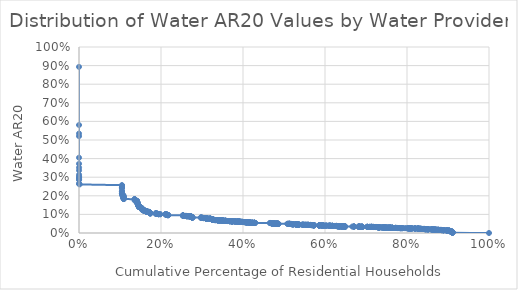
| Category | AR20_water |
|---|---|
| 5.48826520119832e-07 | 0.893 |
| 5.33443075563351e-05 | 0.581 |
| 7.17975943236906e-05 | 0.535 |
| 7.32451695270934e-05 | 0.521 |
| 7.46652534685267e-05 | 0.405 |
| 9.82372535127435e-05 | 0.372 |
| 0.000152683214745455 | 0.352 |
| 0.000185217545983208 | 0.337 |
| 0.00018708458604609 | 0.313 |
| 0.000192971497076845 | 0.304 |
| 0.000193919867193345 | 0.297 |
| 0.000194206909401911 | 0.296 |
| 0.000196433551373386 | 0.288 |
| 0.000198798018053897 | 0.285 |
| 0.00021031373547938 | 0.265 |
| 0.000254667359736511 | 0.264 |
| 0.00158401532059414 | 0.261 |
| 0.104717175594087 | 0.257 |
| 0.104717731194048 | 0.255 |
| 0.104721974051909 | 0.254 |
| 0.10472407977018 | 0.247 |
| 0.104725020967927 | 0.245 |
| 0.104727404614923 | 0.243 |
| 0.104732030883355 | 0.242 |
| 0.104745008982685 | 0.241 |
| 0.10475055911262 | 0.225 |
| 0.104752740565179 | 0.224 |
| 0.104753450633753 | 0.222 |
| 0.104754679258546 | 0.214 |
| 0.104755242322187 | 0.212 |
| 0.104756998741014 | 0.212 |
| 0.105547062052138 | 0.212 |
| 0.105547900815649 | 0.208 |
| 0.105566377816492 | 0.204 |
| 0.105567160821771 | 0.203 |
| 0.108078254910355 | 0.203 |
| 0.108079344993869 | 0.201 |
| 0.108081290420234 | 0.201 |
| 0.108102868388849 | 0.198 |
| 0.108310116820655 | 0.197 |
| 0.108310805948697 | 0.196 |
| 0.108318891051255 | 0.194 |
| 0.108320298879155 | 0.193 |
| 0.108321601371382 | 0.193 |
| 0.108468333978576 | 0.191 |
| 0.108489911894035 | 0.191 |
| 0.108491312655666 | 0.191 |
| 0.10849314180988 | 0.19 |
| 0.108649396326619 | 0.189 |
| 0.10865224404718 | 0.188 |
| 0.10865589329647 | 0.188 |
| 0.109079629059559 | 0.185 |
| 0.109084453345461 | 0.184 |
| 0.109102120983116 | 0.184 |
| 0.109174590841017 | 0.183 |
| 0.10947178042393 | 0.183 |
| 0.135625108007674 | 0.182 |
| 0.135745422342627 | 0.182 |
| 0.135746945628824 | 0.182 |
| 0.135768567103993 | 0.18 |
| 0.135772822994069 | 0.175 |
| 0.140749622953361 | 0.174 |
| 0.140762476795443 | 0.173 |
| 0.141231758383799 | 0.172 |
| 0.141233521076032 | 0.171 |
| 0.141272968175936 | 0.171 |
| 0.141274326049834 | 0.171 |
| 0.141275503965606 | 0.171 |
| 0.141275954128321 | 0.17 |
| 0.14181448025107 | 0.17 |
| 0.141814532742776 | 0.169 |
| 0.141957907569051 | 0.169 |
| 0.141974335239768 | 0.167 |
| 0.141975525057033 | 0.166 |
| 0.141975558936613 | 0.166 |
| 0.141978437540289 | 0.165 |
| 0.141980825006962 | 0.164 |
| 0.141981205243203 | 0.164 |
| 0.14211865309561 | 0.163 |
| 0.142126897296326 | 0.162 |
| 0.142135723088024 | 0.162 |
| 0.1428501834919 | 0.161 |
| 0.142853520724775 | 0.16 |
| 0.142858923338005 | 0.16 |
| 0.142859416655846 | 0.159 |
| 0.14286002632502 | 0.158 |
| 0.142907653886489 | 0.156 |
| 0.144169377643712 | 0.154 |
| 0.144169664596215 | 0.154 |
| 0.14418135218488 | 0.152 |
| 0.144181626039439 | 0.152 |
| 0.144471720387026 | 0.152 |
| 0.144475755012018 | 0.152 |
| 0.144476044316648 | 0.151 |
| 0.14464427311294 | 0.151 |
| 0.144652183313278 | 0.15 |
| 0.14465257388006 | 0.149 |
| 0.144698699253106 | 0.149 |
| 0.144700216437633 | 0.149 |
| 0.144809113660681 | 0.149 |
| 0.144862732555948 | 0.149 |
| 0.144863480914962 | 0.148 |
| 0.144866039635365 | 0.148 |
| 0.1449036948163 | 0.147 |
| 0.144915533723856 | 0.146 |
| 0.145029841850773 | 0.146 |
| 0.145030220127452 | 0.146 |
| 0.145039108250192 | 0.146 |
| 0.145053218813044 | 0.146 |
| 0.145054320242697 | 0.146 |
| 0.145266663075347 | 0.145 |
| 0.145355311713027 | 0.145 |
| 0.14535655121525 | 0.145 |
| 0.145356842465169 | 0.145 |
| 0.145537754611876 | 0.144 |
| 0.14555044598384 | 0.144 |
| 0.146108618052085 | 0.143 |
| 0.146115607865619 | 0.143 |
| 0.146117545691274 | 0.142 |
| 0.146120437375933 | 0.142 |
| 0.146124487636269 | 0.141 |
| 0.146126386660919 | 0.141 |
| 0.146126513266985 | 0.14 |
| 0.146128062779762 | 0.14 |
| 0.146138194435437 | 0.14 |
| 0.148695590711267 | 0.139 |
| 0.148696277403705 | 0.139 |
| 0.150008164255815 | 0.138 |
| 0.15002382574469 | 0.138 |
| 0.150119668818904 | 0.137 |
| 0.150127816316986 | 0.137 |
| 0.150131711383511 | 0.137 |
| 0.150326442224384 | 0.136 |
| 0.150327133771212 | 0.136 |
| 0.150351969956333 | 0.135 |
| 0.150354783037938 | 0.135 |
| 0.150557480799816 | 0.135 |
| 0.151779860087728 | 0.135 |
| 0.152758558291158 | 0.134 |
| 0.152811657275968 | 0.134 |
| 0.153215564725626 | 0.134 |
| 0.153215815977268 | 0.134 |
| 0.153244215198625 | 0.132 |
| 0.153246636894051 | 0.132 |
| 0.153469979480928 | 0.131 |
| 0.153491172438077 | 0.131 |
| 0.153503544023742 | 0.13 |
| 0.153513023177764 | 0.13 |
| 0.153609868442891 | 0.129 |
| 0.15361308045813 | 0.128 |
| 0.153613160257083 | 0.128 |
| 0.153613178908403 | 0.127 |
| 0.153614430181477 | 0.127 |
| 0.153615351403281 | 0.126 |
| 0.154534723338053 | 0.125 |
| 0.15453474428624 | 0.124 |
| 0.154561941722469 | 0.124 |
| 0.155402783506463 | 0.124 |
| 0.155402808102282 | 0.123 |
| 0.155533221049613 | 0.123 |
| 0.155535761733695 | 0.123 |
| 0.1557114033105 | 0.123 |
| 0.15571173583455 | 0.123 |
| 0.156227224382155 | 0.123 |
| 0.156241349885727 | 0.123 |
| 0.156244186719691 | 0.122 |
| 0.156249714598593 | 0.122 |
| 0.156251811209592 | 0.122 |
| 0.158366802293811 | 0.122 |
| 0.15876797548302 | 0.122 |
| 0.158799055789782 | 0.122 |
| 0.15907884600842 | 0.121 |
| 0.15912375018832 | 0.121 |
| 0.159127973881177 | 0.121 |
| 0.159756630171463 | 0.12 |
| 0.159757165247364 | 0.12 |
| 0.159762433371661 | 0.12 |
| 0.159771542107886 | 0.119 |
| 0.162516646692113 | 0.119 |
| 0.162630493575464 | 0.119 |
| 0.162633373351513 | 0.119 |
| 0.162784903683555 | 0.118 |
| 0.163230859033297 | 0.118 |
| 0.163610927169065 | 0.118 |
| 0.16361356691347 | 0.118 |
| 0.163699879183226 | 0.117 |
| 0.163700525015797 | 0.117 |
| 0.163728975193679 | 0.117 |
| 0.163760993111823 | 0.117 |
| 0.163775274116508 | 0.117 |
| 0.16377891020173 | 0.117 |
| 0.16379034822041 | 0.117 |
| 0.163828460714891 | 0.117 |
| 0.164017274864795 | 0.117 |
| 0.164022528651714 | 0.116 |
| 0.16402315350218 | 0.115 |
| 0.16531001929676 | 0.115 |
| 0.165932529564245 | 0.115 |
| 0.165942390301564 | 0.114 |
| 0.168954380427605 | 0.114 |
| 0.16970069258977 | 0.114 |
| 0.169778381771062 | 0.114 |
| 0.170251232475266 | 0.113 |
| 0.170479598848609 | 0.113 |
| 0.17089405661162 | 0.113 |
| 0.170991015694786 | 0.112 |
| 0.170991602262176 | 0.112 |
| 0.1709935211717 | 0.112 |
| 0.171087548094901 | 0.112 |
| 0.171363539465114 | 0.112 |
| 0.171363725769387 | 0.112 |
| 0.171538399084244 | 0.111 |
| 0.171539329386861 | 0.111 |
| 0.171540969581891 | 0.111 |
| 0.171541162092218 | 0.11 |
| 0.171548089891991 | 0.11 |
| 0.171548742377002 | 0.11 |
| 0.17155682340304 | 0.11 |
| 0.17199800207349 | 0.11 |
| 0.171999439193243 | 0.11 |
| 0.172189257666142 | 0.11 |
| 0.17292432353312 | 0.109 |
| 0.173228027742628 | 0.109 |
| 0.173228754058835 | 0.109 |
| 0.173247567546621 | 0.109 |
| 0.173251009463529 | 0.109 |
| 0.173254526983395 | 0.109 |
| 0.173255779470781 | 0.108 |
| 0.17325642668752 | 0.108 |
| 0.173256748090358 | 0.108 |
| 0.173313381910261 | 0.108 |
| 0.173318286895126 | 0.108 |
| 0.173324007223015 | 0.108 |
| 0.173516939058462 | 0.108 |
| 0.173517207755381 | 0.108 |
| 0.173518009855688 | 0.108 |
| 0.173532243231787 | 0.108 |
| 0.173581803083251 | 0.107 |
| 0.173590689729314 | 0.107 |
| 0.173671651383745 | 0.106 |
| 0.173787511074138 | 0.106 |
| 0.173787990871546 | 0.106 |
| 0.174040350853437 | 0.105 |
| 0.174284354845443 | 0.105 |
| 0.187355316860845 | 0.105 |
| 0.187360249031746 | 0.105 |
| 0.18737362368849 | 0.105 |
| 0.187374307899396 | 0.105 |
| 0.187374782894361 | 0.105 |
| 0.187378052610326 | 0.105 |
| 0.187378874781853 | 0.105 |
| 0.187750218131801 | 0.104 |
| 0.187758512635737 | 0.104 |
| 0.187766789373877 | 0.104 |
| 0.187768688319815 | 0.104 |
| 0.187771934516876 | 0.104 |
| 0.187774138081653 | 0.104 |
| 0.188081579661938 | 0.104 |
| 0.1881104496371 | 0.104 |
| 0.189372997541356 | 0.104 |
| 0.189376613778477 | 0.104 |
| 0.190384302448822 | 0.104 |
| 0.190769783943991 | 0.103 |
| 0.19113521999088 | 0.103 |
| 0.1911453943438 | 0.103 |
| 0.191162313864621 | 0.103 |
| 0.191164985616179 | 0.103 |
| 0.191170965375125 | 0.103 |
| 0.191231824268957 | 0.103 |
| 0.192639583186815 | 0.103 |
| 0.192641060313828 | 0.102 |
| 0.193573052323719 | 0.102 |
| 0.193574235742487 | 0.102 |
| 0.193576505219862 | 0.101 |
| 0.193589671931329 | 0.101 |
| 0.193741272393085 | 0.101 |
| 0.193742942078867 | 0.101 |
| 0.198068711658362 | 0.101 |
| 0.198073115541988 | 0.101 |
| 0.210972683709943 | 0.101 |
| 0.21097495991001 | 0.1 |
| 0.211239061721474 | 0.1 |
| 0.211240819165294 | 0.1 |
| 0.211661839999989 | 0.1 |
| 0.211663379655726 | 0.1 |
| 0.211667840318943 | 0.1 |
| 0.21187543570576 | 0.1 |
| 0.211924325127556 | 0.1 |
| 0.21220372103457 | 0.099 |
| 0.212218205256069 | 0.099 |
| 0.214094246366238 | 0.099 |
| 0.214099354898056 | 0.099 |
| 0.214102634451455 | 0.099 |
| 0.214600695613969 | 0.098 |
| 0.21460298957694 | 0.098 |
| 0.214624325661998 | 0.098 |
| 0.214641994733994 | 0.098 |
| 0.214644140948804 | 0.098 |
| 0.215955092079753 | 0.098 |
| 0.216045054079949 | 0.097 |
| 0.216048751936158 | 0.097 |
| 0.216219962405102 | 0.097 |
| 0.21622281961789 | 0.097 |
| 0.21623871516207 | 0.097 |
| 0.216242461290008 | 0.097 |
| 0.21624255130028 | 0.096 |
| 0.216354578802241 | 0.096 |
| 0.21678689171895 | 0.096 |
| 0.216807561180731 | 0.096 |
| 0.216964437858436 | 0.096 |
| 0.217000801309951 | 0.096 |
| 0.217043031727642 | 0.096 |
| 0.217044038660181 | 0.096 |
| 0.217810024079918 | 0.095 |
| 0.253542924567145 | 0.095 |
| 0.253592358178173 | 0.095 |
| 0.253593271928532 | 0.094 |
| 0.253594583368249 | 0.094 |
| 0.253594620805487 | 0.094 |
| 0.253598171822951 | 0.094 |
| 0.253598808219161 | 0.094 |
| 0.253632153004112 | 0.094 |
| 0.253679268466591 | 0.094 |
| 0.253679766848541 | 0.094 |
| 0.253685932823451 | 0.093 |
| 0.253690170820083 | 0.093 |
| 0.253692290234253 | 0.093 |
| 0.253693711499907 | 0.093 |
| 0.253698020188119 | 0.093 |
| 0.253966709085884 | 0.093 |
| 0.253966925734445 | 0.093 |
| 0.254267213033362 | 0.093 |
| 0.254271007383559 | 0.093 |
| 0.254273329247524 | 0.093 |
| 0.254275294223414 | 0.093 |
| 0.254367575700592 | 0.093 |
| 0.254371283450844 | 0.092 |
| 0.254401094832214 | 0.092 |
| 0.254404998215473 | 0.092 |
| 0.254427321650423 | 0.092 |
| 0.254662286979664 | 0.092 |
| 0.254680752200024 | 0.092 |
| 0.255414561294178 | 0.092 |
| 0.255505334658586 | 0.092 |
| 0.260325921096529 | 0.092 |
| 0.260337458960746 | 0.092 |
| 0.260338415184722 | 0.092 |
| 0.261405801539102 | 0.092 |
| 0.262195979378908 | 0.092 |
| 0.262469959642288 | 0.091 |
| 0.262495172276847 | 0.091 |
| 0.262716016305039 | 0.091 |
| 0.262717847396935 | 0.091 |
| 0.262722534770665 | 0.091 |
| 0.263197372491987 | 0.091 |
| 0.263318584435193 | 0.091 |
| 0.26345886552132 | 0.091 |
| 0.263463371317303 | 0.091 |
| 0.26347706365235 | 0.09 |
| 0.263551827283405 | 0.09 |
| 0.263552593194918 | 0.09 |
| 0.263552665066503 | 0.09 |
| 0.263569568187439 | 0.09 |
| 0.267324134078891 | 0.09 |
| 0.267382316933583 | 0.09 |
| 0.267382417898174 | 0.09 |
| 0.267537404956899 | 0.09 |
| 0.271300344444213 | 0.09 |
| 0.271474089613913 | 0.089 |
| 0.271474729878067 | 0.089 |
| 0.271553880863112 | 0.089 |
| 0.271558354530314 | 0.089 |
| 0.271640769875463 | 0.089 |
| 0.271642146435444 | 0.089 |
| 0.272252078716745 | 0.089 |
| 0.27226248883811 | 0.089 |
| 0.272395148078286 | 0.089 |
| 0.272431154212116 | 0.089 |
| 0.272435348652926 | 0.089 |
| 0.272696188980686 | 0.089 |
| 0.272706385308346 | 0.089 |
| 0.272714234926202 | 0.089 |
| 0.272929487187246 | 0.088 |
| 0.27298481406088 | 0.088 |
| 0.272987944332406 | 0.088 |
| 0.272990843512981 | 0.088 |
| 0.272991535789075 | 0.088 |
| 0.272992385429204 | 0.088 |
| 0.272992436259291 | 0.088 |
| 0.273937281965032 | 0.088 |
| 0.273961986595515 | 0.088 |
| 0.273962004664065 | 0.088 |
| 0.274102069665581 | 0.087 |
| 0.274144223457059 | 0.087 |
| 0.27415571379915 | 0.087 |
| 0.274441988088365 | 0.087 |
| 0.274447627863214 | 0.087 |
| 0.274553358651966 | 0.087 |
| 0.274554027264649 | 0.087 |
| 0.274557982570366 | 0.086 |
| 0.274558720454995 | 0.086 |
| 0.275202394535183 | 0.086 |
| 0.275398160343589 | 0.086 |
| 0.275399589889054 | 0.086 |
| 0.275401376632994 | 0.086 |
| 0.275401635209662 | 0.086 |
| 0.275422130288297 | 0.086 |
| 0.275434268347336 | 0.085 |
| 0.275435484253015 | 0.084 |
| 0.275455881760448 | 0.084 |
| 0.275459145115882 | 0.084 |
| 0.275460068588848 | 0.084 |
| 0.275460823499903 | 0.084 |
| 0.275494175909752 | 0.084 |
| 0.275500526652258 | 0.084 |
| 0.276105857140725 | 0.084 |
| 0.276112446616653 | 0.084 |
| 0.276192836067765 | 0.084 |
| 0.276197452616798 | 0.083 |
| 0.27620160292891 | 0.083 |
| 0.276240349644352 | 0.083 |
| 0.276240459901271 | 0.083 |
| 0.276305971914534 | 0.083 |
| 0.277816821283549 | 0.083 |
| 0.296946700883258 | 0.083 |
| 0.296949453954 | 0.083 |
| 0.297418817518782 | 0.083 |
| 0.297941034019051 | 0.083 |
| 0.297944376169543 | 0.082 |
| 0.298314906931692 | 0.082 |
| 0.298316617177155 | 0.082 |
| 0.300240341851368 | 0.082 |
| 0.300240569205487 | 0.082 |
| 0.300280126697297 | 0.082 |
| 0.300289915383283 | 0.082 |
| 0.30072041406901 | 0.081 |
| 0.300843901373427 | 0.081 |
| 0.304042434040463 | 0.081 |
| 0.304146694978565 | 0.081 |
| 0.304158056938861 | 0.08 |
| 0.304420122940313 | 0.08 |
| 0.304449970634368 | 0.08 |
| 0.309313301671617 | 0.08 |
| 0.309313535595477 | 0.08 |
| 0.309319152809888 | 0.079 |
| 0.309329621579862 | 0.079 |
| 0.309342853699144 | 0.079 |
| 0.309344084877459 | 0.079 |
| 0.309352986871031 | 0.079 |
| 0.309359940303056 | 0.079 |
| 0.309563396797485 | 0.079 |
| 0.310224031692961 | 0.079 |
| 0.310225165100375 | 0.079 |
| 0.310226338059359 | 0.079 |
| 0.310308097551304 | 0.078 |
| 0.310940863879933 | 0.078 |
| 0.310943804535232 | 0.078 |
| 0.311014358334514 | 0.078 |
| 0.313240611249548 | 0.078 |
| 0.313332942056095 | 0.078 |
| 0.313559841627607 | 0.078 |
| 0.313567233905346 | 0.078 |
| 0.313575513506024 | 0.077 |
| 0.319366856840906 | 0.077 |
| 0.319370627654323 | 0.077 |
| 0.319373932397301 | 0.077 |
| 0.319373964913849 | 0.077 |
| 0.319387085624335 | 0.077 |
| 0.319387448395676 | 0.077 |
| 0.319391110531045 | 0.076 |
| 0.319417858116969 | 0.076 |
| 0.319434147510693 | 0.076 |
| 0.319437189290771 | 0.076 |
| 0.320599406050837 | 0.076 |
| 0.320754808876234 | 0.076 |
| 0.320795504775946 | 0.076 |
| 0.320826468621046 | 0.076 |
| 0.320828633960267 | 0.076 |
| 0.32095168552627 | 0.076 |
| 0.320954540733687 | 0.076 |
| 0.321007045647838 | 0.076 |
| 0.321353796641929 | 0.076 |
| 0.322653804922683 | 0.076 |
| 0.323075740536405 | 0.076 |
| 0.323321800378338 | 0.075 |
| 0.323872532272571 | 0.075 |
| 0.323873934180837 | 0.075 |
| 0.323875332910802 | 0.075 |
| 0.323877680803045 | 0.075 |
| 0.325398172109292 | 0.075 |
| 0.325470524967287 | 0.075 |
| 0.325470803997123 | 0.074 |
| 0.325474031992765 | 0.074 |
| 0.325492460645385 | 0.074 |
| 0.32549675206121 | 0.074 |
| 0.325507285001496 | 0.074 |
| 0.325510332559828 | 0.074 |
| 0.325511219080292 | 0.074 |
| 0.325522960431509 | 0.074 |
| 0.325527037941343 | 0.074 |
| 0.325539966353165 | 0.074 |
| 0.325679223453543 | 0.074 |
| 0.325679667193468 | 0.074 |
| 0.325681416364159 | 0.074 |
| 0.325684082096923 | 0.073 |
| 0.325684259868916 | 0.073 |
| 0.325684616854414 | 0.073 |
| 0.325690874532358 | 0.073 |
| 0.326168746476773 | 0.073 |
| 0.326171579644987 | 0.073 |
| 0.326316515133542 | 0.073 |
| 0.326317758854603 | 0.072 |
| 0.326319520051918 | 0.072 |
| 0.326320582490528 | 0.072 |
| 0.326321791946692 | 0.072 |
| 0.326322392917539 | 0.072 |
| 0.326326507567267 | 0.072 |
| 0.326326913295612 | 0.072 |
| 0.326379530626725 | 0.072 |
| 0.326501868472725 | 0.072 |
| 0.326506169114277 | 0.072 |
| 0.326516800707838 | 0.072 |
| 0.326532505057544 | 0.072 |
| 0.3265329079188 | 0.072 |
| 0.326534870866406 | 0.072 |
| 0.326537597143235 | 0.072 |
| 0.326538049763779 | 0.071 |
| 0.326543225397102 | 0.071 |
| 0.326566988155818 | 0.071 |
| 0.326576177409183 | 0.071 |
| 0.326594792681978 | 0.071 |
| 0.326667140258349 | 0.071 |
| 0.326669851027303 | 0.071 |
| 0.327565005925815 | 0.071 |
| 0.327566994279963 | 0.071 |
| 0.327570438780203 | 0.071 |
| 0.327611202874682 | 0.071 |
| 0.327627183035785 | 0.071 |
| 0.330834141616255 | 0.07 |
| 0.330836118594406 | 0.07 |
| 0.330888209779791 | 0.07 |
| 0.33090286336508 | 0.07 |
| 0.331160886597756 | 0.07 |
| 0.331164832259263 | 0.07 |
| 0.331167497999215 | 0.07 |
| 0.331809547300281 | 0.07 |
| 0.331813451642271 | 0.07 |
| 0.331970849669685 | 0.07 |
| 0.332024211381915 | 0.07 |
| 0.332026575508249 | 0.069 |
| 0.33210139172752 | 0.069 |
| 0.332105697016839 | 0.069 |
| 0.332108860629337 | 0.069 |
| 0.332286234559781 | 0.069 |
| 0.336627733750877 | 0.069 |
| 0.336713105047593 | 0.069 |
| 0.337152128435815 | 0.069 |
| 0.337305955931329 | 0.069 |
| 0.337807128303557 | 0.069 |
| 0.337807850858524 | 0.069 |
| 0.337828244434283 | 0.069 |
| 0.337839877753273 | 0.069 |
| 0.337847088196931 | 0.069 |
| 0.337847432209778 | 0.069 |
| 0.337848012501764 | 0.069 |
| 0.337849054320766 | 0.069 |
| 0.339936932119065 | 0.068 |
| 0.33993848631477 | 0.068 |
| 0.339941068580472 | 0.068 |
| 0.339950039828578 | 0.068 |
| 0.340178758995684 | 0.068 |
| 0.34228155340026 | 0.068 |
| 0.342281685095025 | 0.068 |
| 0.342496325222974 | 0.068 |
| 0.342496956378907 | 0.068 |
| 0.342503932129519 | 0.068 |
| 0.342508968799578 | 0.068 |
| 0.342638152861656 | 0.068 |
| 0.342652013979851 | 0.068 |
| 0.342656012379002 | 0.068 |
| 0.342661834734063 | 0.068 |
| 0.342664737221941 | 0.068 |
| 0.342712569787329 | 0.068 |
| 0.34281814814488 | 0.068 |
| 0.342819716726109 | 0.068 |
| 0.343488183521589 | 0.068 |
| 0.343489071528332 | 0.068 |
| 0.346692357444098 | 0.068 |
| 0.346694356464139 | 0.068 |
| 0.346746893264042 | 0.068 |
| 0.346835159857414 | 0.067 |
| 0.347111210200013 | 0.067 |
| 0.348514449336458 | 0.067 |
| 0.348516799859762 | 0.067 |
| 0.34887487236128 | 0.067 |
| 0.348935372257307 | 0.067 |
| 0.348971345636466 | 0.067 |
| 0.348979277025113 | 0.067 |
| 0.34898422457212 | 0.067 |
| 0.349024357022117 | 0.067 |
| 0.349893929904835 | 0.067 |
| 0.350018789169357 | 0.067 |
| 0.350450326668117 | 0.066 |
| 0.350457678668932 | 0.066 |
| 0.350458558412072 | 0.066 |
| 0.350459164690907 | 0.066 |
| 0.35045976028535 | 0.066 |
| 0.351263984898342 | 0.066 |
| 0.351281050375246 | 0.066 |
| 0.351305006359992 | 0.066 |
| 0.352519012267868 | 0.066 |
| 0.352521309653262 | 0.066 |
| 0.352521649384128 | 0.066 |
| 0.35254787518183 | 0.066 |
| 0.354292730605521 | 0.066 |
| 0.354293378558427 | 0.066 |
| 0.354295898236347 | 0.066 |
| 0.354300942841655 | 0.066 |
| 0.357179548443655 | 0.065 |
| 0.357197869312362 | 0.065 |
| 0.35722033105023 | 0.065 |
| 0.357220343106734 | 0.065 |
| 0.35749887091639 | 0.065 |
| 0.357503375582239 | 0.065 |
| 0.357538490400837 | 0.065 |
| 0.357710267749766 | 0.065 |
| 0.357711502117243 | 0.065 |
| 0.357713113089607 | 0.065 |
| 0.357724332143518 | 0.065 |
| 0.358722781551637 | 0.065 |
| 0.358828117381056 | 0.065 |
| 0.358829726027146 | 0.065 |
| 0.358829726031879 | 0.065 |
| 0.358829931321607 | 0.065 |
| 0.358832948641616 | 0.065 |
| 0.358837370959378 | 0.065 |
| 0.358845261384866 | 0.065 |
| 0.36271939940626 | 0.064 |
| 0.362738311170842 | 0.064 |
| 0.366998100805456 | 0.064 |
| 0.367079208294567 | 0.064 |
| 0.367084071225475 | 0.064 |
| 0.367084878023746 | 0.064 |
| 0.367087500753398 | 0.064 |
| 0.367352516465983 | 0.064 |
| 0.367353714441994 | 0.064 |
| 0.367355864344083 | 0.064 |
| 0.367369399143133 | 0.064 |
| 0.369680474779205 | 0.063 |
| 0.370615814819556 | 0.063 |
| 0.371163435212155 | 0.063 |
| 0.371175594267467 | 0.063 |
| 0.371340692998121 | 0.063 |
| 0.371374130932954 | 0.063 |
| 0.371393274340843 | 0.063 |
| 0.371393778108841 | 0.063 |
| 0.372717681297014 | 0.063 |
| 0.373256154113975 | 0.063 |
| 0.373267334485521 | 0.063 |
| 0.373278182487224 | 0.063 |
| 0.37327889382813 | 0.063 |
| 0.373280055667531 | 0.063 |
| 0.373280631801144 | 0.063 |
| 0.373280692726519 | 0.063 |
| 0.374054381017377 | 0.063 |
| 0.37405488234437 | 0.063 |
| 0.374188822868319 | 0.063 |
| 0.374189556446414 | 0.063 |
| 0.374189608217448 | 0.062 |
| 0.374193108299597 | 0.062 |
| 0.376133055428295 | 0.062 |
| 0.380319768581246 | 0.062 |
| 0.380322055521037 | 0.062 |
| 0.380322920864284 | 0.062 |
| 0.380327729883188 | 0.062 |
| 0.380618810005321 | 0.062 |
| 0.380622102151039 | 0.062 |
| 0.381613023623873 | 0.062 |
| 0.384311260339805 | 0.062 |
| 0.384312522630948 | 0.062 |
| 0.386282363123404 | 0.062 |
| 0.386283252433246 | 0.062 |
| 0.387025285141683 | 0.062 |
| 0.387026233931708 | 0.061 |
| 0.387027182022892 | 0.061 |
| 0.387034132194984 | 0.061 |
| 0.387049358614088 | 0.061 |
| 0.387059877991368 | 0.061 |
| 0.387062516862548 | 0.061 |
| 0.390091750561264 | 0.061 |
| 0.390099063183471 | 0.061 |
| 0.390227583703571 | 0.061 |
| 0.390407295414623 | 0.061 |
| 0.390512075892387 | 0.061 |
| 0.390525366828483 | 0.061 |
| 0.390533786176927 | 0.061 |
| 0.390536263456847 | 0.061 |
| 0.390537689996866 | 0.061 |
| 0.390538081487192 | 0.061 |
| 0.390788125376076 | 0.061 |
| 0.391655165563975 | 0.061 |
| 0.391657572576156 | 0.061 |
| 0.391672917992287 | 0.061 |
| 0.391699038047394 | 0.06 |
| 0.391711615018035 | 0.06 |
| 0.391713093222205 | 0.06 |
| 0.391713781965131 | 0.06 |
| 0.391735989871644 | 0.06 |
| 0.391918417840815 | 0.06 |
| 0.391921845611688 | 0.06 |
| 0.392144619472695 | 0.06 |
| 0.3924636946895 | 0.06 |
| 0.392647019712648 | 0.06 |
| 0.392648234674662 | 0.06 |
| 0.39265242498175 | 0.06 |
| 0.392676925524033 | 0.06 |
| 0.392876931914986 | 0.06 |
| 0.393725143642301 | 0.06 |
| 0.393748113557257 | 0.06 |
| 0.396117977892906 | 0.06 |
| 0.396188341851114 | 0.06 |
| 0.396231494652382 | 0.06 |
| 0.396235783430831 | 0.06 |
| 0.396261846949514 | 0.06 |
| 0.396286899488686 | 0.06 |
| 0.39913063116177 | 0.06 |
| 0.399224769658201 | 0.06 |
| 0.39922589388544 | 0.06 |
| 0.399230941918622 | 0.06 |
| 0.399286990778489 | 0.059 |
| 0.399288069166431 | 0.059 |
| 0.39928985030936 | 0.059 |
| 0.39931600556201 | 0.059 |
| 0.399330613965852 | 0.059 |
| 0.399361641220418 | 0.059 |
| 0.399622229992447 | 0.059 |
| 0.399976331777474 | 0.059 |
| 0.400054680670829 | 0.059 |
| 0.400099741198819 | 0.059 |
| 0.401656105893265 | 0.059 |
| 0.40165801075087 | 0.059 |
| 0.402011954407402 | 0.059 |
| 0.404174723449309 | 0.059 |
| 0.40417582443321 | 0.059 |
| 0.405072752080648 | 0.058 |
| 0.405072853484634 | 0.058 |
| 0.405072884112835 | 0.058 |
| 0.405240872638939 | 0.058 |
| 0.405526045760588 | 0.058 |
| 0.405526975334643 | 0.058 |
| 0.405537827388378 | 0.058 |
| 0.405564918719626 | 0.058 |
| 0.405565602066661 | 0.058 |
| 0.407700112807597 | 0.058 |
| 0.407700967507363 | 0.058 |
| 0.407700991400694 | 0.058 |
| 0.407701546665761 | 0.058 |
| 0.407886139989236 | 0.058 |
| 0.407887153635655 | 0.058 |
| 0.409119080076894 | 0.058 |
| 0.409152153922809 | 0.058 |
| 0.409154139497438 | 0.058 |
| 0.40915662930813 | 0.058 |
| 0.409166330167709 | 0.058 |
| 0.40916908808694 | 0.058 |
| 0.409169614777129 | 0.058 |
| 0.409182277628474 | 0.058 |
| 0.409183188633191 | 0.057 |
| 0.409191122147163 | 0.057 |
| 0.409194310670833 | 0.057 |
| 0.409197397994863 | 0.057 |
| 0.409200674559659 | 0.057 |
| 0.410100856552512 | 0.057 |
| 0.413074845583542 | 0.057 |
| 0.413608422467405 | 0.057 |
| 0.413747248647746 | 0.057 |
| 0.413759695003262 | 0.057 |
| 0.4140029425176 | 0.057 |
| 0.41490327729566 | 0.057 |
| 0.414903960733061 | 0.057 |
| 0.415131428456706 | 0.057 |
| 0.415140595139724 | 0.057 |
| 0.415153981893161 | 0.057 |
| 0.415419697241649 | 0.057 |
| 0.415420097441508 | 0.057 |
| 0.415479308190762 | 0.057 |
| 0.415895271616648 | 0.057 |
| 0.41590729152755 | 0.056 |
| 0.415984773624306 | 0.056 |
| 0.416175522544624 | 0.056 |
| 0.416176319942694 | 0.056 |
| 0.416181380338856 | 0.056 |
| 0.416188435716241 | 0.056 |
| 0.416191111605932 | 0.056 |
| 0.416197580392288 | 0.056 |
| 0.416202598271111 | 0.056 |
| 0.416236635657769 | 0.056 |
| 0.416311688931053 | 0.056 |
| 0.416314242470981 | 0.056 |
| 0.416317587977324 | 0.056 |
| 0.416318603165619 | 0.056 |
| 0.416324287180943 | 0.056 |
| 0.416326088459569 | 0.056 |
| 0.416462465237326 | 0.056 |
| 0.416616210485974 | 0.056 |
| 0.416809252328136 | 0.056 |
| 0.416809843212417 | 0.056 |
| 0.418324151914102 | 0.056 |
| 0.418341334988601 | 0.055 |
| 0.418345016910654 | 0.055 |
| 0.418468311027855 | 0.055 |
| 0.418546043136623 | 0.055 |
| 0.418563014540109 | 0.055 |
| 0.418563852369157 | 0.055 |
| 0.41856790070799 | 0.055 |
| 0.422333733822433 | 0.055 |
| 0.422358305862787 | 0.055 |
| 0.422383934647794 | 0.055 |
| 0.422387219037908 | 0.055 |
| 0.422389375387854 | 0.055 |
| 0.422622187114626 | 0.055 |
| 0.422707990024814 | 0.055 |
| 0.422708333925434 | 0.055 |
| 0.422837427662041 | 0.055 |
| 0.422845137219383 | 0.055 |
| 0.424604006209293 | 0.055 |
| 0.42460550105642 | 0.054 |
| 0.424620008638039 | 0.054 |
| 0.424721928388312 | 0.054 |
| 0.424722924321908 | 0.054 |
| 0.424729970838456 | 0.054 |
| 0.424738835340228 | 0.054 |
| 0.427509656189644 | 0.054 |
| 0.427509688161326 | 0.054 |
| 0.427512308861826 | 0.054 |
| 0.427761057415571 | 0.054 |
| 0.427785154158536 | 0.054 |
| 0.427789016033143 | 0.054 |
| 0.427791101439622 | 0.054 |
| 0.427963036855037 | 0.054 |
| 0.428287448598407 | 0.054 |
| 0.428337026475042 | 0.054 |
| 0.428337748035435 | 0.054 |
| 0.428357442799603 | 0.054 |
| 0.428357442903562 | 0.054 |
| 0.428357710847879 | 0.054 |
| 0.428358493692677 | 0.054 |
| 0.428358532884748 | 0.054 |
| 0.428448018879715 | 0.054 |
| 0.428552449623569 | 0.054 |
| 0.428777829967777 | 0.054 |
| 0.428779347562167 | 0.054 |
| 0.428808764589561 | 0.054 |
| 0.428810532902291 | 0.054 |
| 0.428821948839772 | 0.054 |
| 0.428824790721486 | 0.054 |
| 0.428828066518617 | 0.054 |
| 0.465616648808674 | 0.054 |
| 0.466076040177365 | 0.054 |
| 0.466419432937999 | 0.054 |
| 0.467847103103648 | 0.053 |
| 0.467849584268795 | 0.053 |
| 0.467853917676629 | 0.053 |
| 0.467854397430751 | 0.053 |
| 0.46786517743573 | 0.053 |
| 0.468938780178682 | 0.053 |
| 0.469102146558794 | 0.053 |
| 0.469148741994588 | 0.053 |
| 0.469184426692238 | 0.053 |
| 0.469185825292842 | 0.053 |
| 0.469615504456994 | 0.053 |
| 0.469843325470747 | 0.053 |
| 0.469912949712299 | 0.053 |
| 0.469913871787844 | 0.053 |
| 0.469942581467245 | 0.053 |
| 0.4699522355194 | 0.052 |
| 0.469954680746055 | 0.052 |
| 0.469955576950786 | 0.052 |
| 0.470012776516909 | 0.052 |
| 0.470358561347181 | 0.052 |
| 0.470360408221514 | 0.052 |
| 0.470360451011792 | 0.052 |
| 0.470362020729575 | 0.052 |
| 0.470362065493535 | 0.052 |
| 0.471414338634869 | 0.052 |
| 0.47142026611986 | 0.052 |
| 0.471488740161386 | 0.052 |
| 0.471494397956932 | 0.052 |
| 0.472084091933597 | 0.052 |
| 0.47208927514467 | 0.052 |
| 0.472688970668939 | 0.052 |
| 0.472733918157929 | 0.052 |
| 0.472735382604314 | 0.052 |
| 0.472884080407193 | 0.052 |
| 0.473848497523107 | 0.052 |
| 0.473848504338632 | 0.051 |
| 0.474583557698397 | 0.051 |
| 0.474584078506847 | 0.051 |
| 0.474585056006335 | 0.051 |
| 0.474729675636037 | 0.051 |
| 0.474730820563507 | 0.051 |
| 0.475564712227526 | 0.051 |
| 0.475566094872807 | 0.051 |
| 0.475922314585944 | 0.051 |
| 0.476004004616773 | 0.051 |
| 0.476019860390283 | 0.051 |
| 0.476021031284572 | 0.051 |
| 0.47602646252726 | 0.051 |
| 0.476100233041836 | 0.051 |
| 0.476100625678907 | 0.051 |
| 0.476100852244314 | 0.051 |
| 0.476242103500406 | 0.051 |
| 0.476258704890764 | 0.051 |
| 0.476262247234949 | 0.051 |
| 0.476374538357766 | 0.05 |
| 0.478264822632584 | 0.05 |
| 0.47828741123796 | 0.05 |
| 0.47832083808592 | 0.05 |
| 0.478466778302756 | 0.05 |
| 0.478489279303599 | 0.05 |
| 0.478531571077105 | 0.05 |
| 0.478533110687901 | 0.05 |
| 0.48052936114893 | 0.05 |
| 0.481868299104296 | 0.05 |
| 0.481870630476327 | 0.05 |
| 0.481930156563159 | 0.05 |
| 0.481938330854335 | 0.05 |
| 0.481966677939042 | 0.05 |
| 0.482392788226492 | 0.05 |
| 0.482449471480761 | 0.05 |
| 0.482464556813331 | 0.05 |
| 0.482514736510901 | 0.05 |
| 0.482530915894499 | 0.05 |
| 0.482531779716476 | 0.05 |
| 0.484207430245381 | 0.05 |
| 0.484210811762217 | 0.05 |
| 0.484692561594042 | 0.05 |
| 0.484796274409943 | 0.05 |
| 0.484802797638073 | 0.05 |
| 0.485055428305049 | 0.05 |
| 0.485786928117804 | 0.05 |
| 0.485826988453957 | 0.05 |
| 0.486350536812388 | 0.05 |
| 0.486427201312988 | 0.049 |
| 0.48642759050754 | 0.049 |
| 0.508307997415608 | 0.049 |
| 0.508324762484841 | 0.049 |
| 0.510529414283025 | 0.049 |
| 0.511415868831858 | 0.049 |
| 0.511417219012564 | 0.049 |
| 0.512926667340787 | 0.049 |
| 0.512928550927323 | 0.049 |
| 0.512996176120288 | 0.049 |
| 0.513012752159492 | 0.049 |
| 0.513033215262332 | 0.049 |
| 0.513034210187701 | 0.049 |
| 0.51328243274374 | 0.049 |
| 0.514466725094787 | 0.049 |
| 0.514488375883953 | 0.049 |
| 0.514510649910002 | 0.049 |
| 0.515474293522421 | 0.049 |
| 0.515474795927136 | 0.049 |
| 0.515523652545333 | 0.049 |
| 0.51824835484408 | 0.049 |
| 0.518250203739968 | 0.048 |
| 0.518251467629941 | 0.048 |
| 0.518271656619596 | 0.048 |
| 0.518505418285964 | 0.048 |
| 0.518505541642221 | 0.048 |
| 0.518505659831779 | 0.048 |
| 0.518819864330568 | 0.048 |
| 0.518844957050775 | 0.048 |
| 0.518907115079734 | 0.048 |
| 0.519124091799575 | 0.048 |
| 0.519124180280097 | 0.048 |
| 0.519124879849828 | 0.048 |
| 0.519391343680615 | 0.048 |
| 0.519397996275163 | 0.048 |
| 0.51973436246582 | 0.048 |
| 0.521153359163263 | 0.047 |
| 0.521159441359725 | 0.047 |
| 0.521165704464933 | 0.047 |
| 0.521181755301538 | 0.047 |
| 0.521187497702225 | 0.047 |
| 0.521193924782564 | 0.047 |
| 0.521965039247731 | 0.047 |
| 0.521965141075654 | 0.047 |
| 0.52305069185747 | 0.047 |
| 0.523052542673789 | 0.047 |
| 0.523390046591167 | 0.047 |
| 0.523390434300917 | 0.047 |
| 0.529089975162354 | 0.047 |
| 0.529162703510339 | 0.047 |
| 0.52916852720578 | 0.047 |
| 0.529348427511 | 0.047 |
| 0.529385961348551 | 0.047 |
| 0.529387553393317 | 0.046 |
| 0.529391501786106 | 0.046 |
| 0.529407834821069 | 0.046 |
| 0.52964972539005 | 0.046 |
| 0.529778864177744 | 0.046 |
| 0.52978535736519 | 0.046 |
| 0.530758593755144 | 0.046 |
| 0.530786387058131 | 0.046 |
| 0.530786497437389 | 0.046 |
| 0.530794707565102 | 0.046 |
| 0.530802339594481 | 0.046 |
| 0.530811358788884 | 0.046 |
| 0.530836928503418 | 0.046 |
| 0.531752848007306 | 0.046 |
| 0.532444806615543 | 0.046 |
| 0.53268700608387 | 0.046 |
| 0.532704387533512 | 0.046 |
| 0.532862481082077 | 0.046 |
| 0.532863255849165 | 0.046 |
| 0.532865363818536 | 0.046 |
| 0.532868761052293 | 0.045 |
| 0.53396254998411 | 0.045 |
| 0.533962636143161 | 0.045 |
| 0.53396916419835 | 0.045 |
| 0.533971788425874 | 0.045 |
| 0.536284705948659 | 0.045 |
| 0.536295196955789 | 0.045 |
| 0.536299524686569 | 0.045 |
| 0.536299820198656 | 0.045 |
| 0.536300614700883 | 0.045 |
| 0.536308441322899 | 0.045 |
| 0.543038896976329 | 0.045 |
| 0.545732011072889 | 0.045 |
| 0.5461595151036 | 0.045 |
| 0.546161833703089 | 0.045 |
| 0.546162057285757 | 0.045 |
| 0.546182476573027 | 0.045 |
| 0.549926968106204 | 0.045 |
| 0.549931185022468 | 0.045 |
| 0.553345489892955 | 0.044 |
| 0.553345491096093 | 0.044 |
| 0.553377928019765 | 0.044 |
| 0.556718320636087 | 0.044 |
| 0.557474072579071 | 0.044 |
| 0.558664408047103 | 0.044 |
| 0.558709130979403 | 0.044 |
| 0.558882890932956 | 0.044 |
| 0.558893805496504 | 0.044 |
| 0.558898274611392 | 0.044 |
| 0.559015769062347 | 0.044 |
| 0.559015956149033 | 0.043 |
| 0.559016542077613 | 0.043 |
| 0.559017438973432 | 0.043 |
| 0.559019616624311 | 0.043 |
| 0.559120545869978 | 0.043 |
| 0.564760673638561 | 0.043 |
| 0.564762735848536 | 0.043 |
| 0.564778751837119 | 0.043 |
| 0.564779887336326 | 0.043 |
| 0.565229742822336 | 0.043 |
| 0.565518006331178 | 0.043 |
| 0.565521229274738 | 0.043 |
| 0.5659425214463 | 0.043 |
| 0.5659446856883 | 0.043 |
| 0.566032225921939 | 0.043 |
| 0.566818857639181 | 0.043 |
| 0.567155193064379 | 0.043 |
| 0.567163589027393 | 0.043 |
| 0.567166205620609 | 0.043 |
| 0.567936572982778 | 0.043 |
| 0.56793668916979 | 0.043 |
| 0.567951032884035 | 0.043 |
| 0.569549178932525 | 0.043 |
| 0.569564144818017 | 0.042 |
| 0.569716044504022 | 0.042 |
| 0.570496217976956 | 0.042 |
| 0.571179444653775 | 0.042 |
| 0.571226847876369 | 0.042 |
| 0.571232889342604 | 0.042 |
| 0.571371265534711 | 0.042 |
| 0.571375953101476 | 0.042 |
| 0.571785357272633 | 0.042 |
| 0.571790152272997 | 0.042 |
| 0.571908073209172 | 0.042 |
| 0.57191574305211 | 0.042 |
| 0.571917523003322 | 0.042 |
| 0.571917687746191 | 0.042 |
| 0.572007977917893 | 0.042 |
| 0.57207389529419 | 0.042 |
| 0.572606125164939 | 0.041 |
| 0.572607849204304 | 0.041 |
| 0.573427543227711 | 0.041 |
| 0.573452606568198 | 0.041 |
| 0.573728137935564 | 0.041 |
| 0.573866023599959 | 0.041 |
| 0.585573557796924 | 0.041 |
| 0.585573977176808 | 0.041 |
| 0.585574138624668 | 0.041 |
| 0.585574976568458 | 0.041 |
| 0.585619292443576 | 0.041 |
| 0.585641945724944 | 0.041 |
| 0.58564217780109 | 0.041 |
| 0.585802412900615 | 0.041 |
| 0.585825261701758 | 0.041 |
| 0.586251066936972 | 0.041 |
| 0.587453720890252 | 0.041 |
| 0.587458231296343 | 0.041 |
| 0.587460409860235 | 0.041 |
| 0.590486145719939 | 0.041 |
| 0.590714045038908 | 0.041 |
| 0.592549677480986 | 0.041 |
| 0.592615415299884 | 0.04 |
| 0.59262197448791 | 0.04 |
| 0.592792752046613 | 0.04 |
| 0.592843176804573 | 0.04 |
| 0.593186034541482 | 0.04 |
| 0.593544000525582 | 0.04 |
| 0.59355583521368 | 0.04 |
| 0.59355688987619 | 0.04 |
| 0.593606643169317 | 0.04 |
| 0.593608130345095 | 0.04 |
| 0.593608516580354 | 0.04 |
| 0.595739490270785 | 0.04 |
| 0.595739511173247 | 0.04 |
| 0.595739620344066 | 0.04 |
| 0.595744344517629 | 0.04 |
| 0.595746626793385 | 0.04 |
| 0.595746860857697 | 0.04 |
| 0.596343107774545 | 0.04 |
| 0.596343419322345 | 0.04 |
| 0.597778685828465 | 0.04 |
| 0.602360514285386 | 0.04 |
| 0.602360714620252 | 0.04 |
| 0.602360746968279 | 0.039 |
| 0.602375873913314 | 0.039 |
| 0.605316228103976 | 0.039 |
| 0.609397615937602 | 0.039 |
| 0.60941219969921 | 0.039 |
| 0.609412221708948 | 0.039 |
| 0.611890386684451 | 0.039 |
| 0.611912865096338 | 0.039 |
| 0.611959728203741 | 0.039 |
| 0.611961215655323 | 0.039 |
| 0.611962165170533 | 0.039 |
| 0.61199432030888 | 0.039 |
| 0.613111748936919 | 0.039 |
| 0.616770980986808 | 0.039 |
| 0.617398021417771 | 0.039 |
| 0.617540692813613 | 0.039 |
| 0.617542412978332 | 0.038 |
| 0.61843685108444 | 0.038 |
| 0.618437790188142 | 0.038 |
| 0.618486299131117 | 0.038 |
| 0.618737333793883 | 0.038 |
| 0.618740047340221 | 0.038 |
| 0.618927831248532 | 0.038 |
| 0.618931007059106 | 0.038 |
| 0.623202497875784 | 0.038 |
| 0.626388194175116 | 0.038 |
| 0.626463536745704 | 0.038 |
| 0.627207784393195 | 0.038 |
| 0.62751514056431 | 0.038 |
| 0.627517408257125 | 0.038 |
| 0.627525970605249 | 0.038 |
| 0.627526100248165 | 0.038 |
| 0.628114776144278 | 0.038 |
| 0.628120598659194 | 0.038 |
| 0.628144944646076 | 0.038 |
| 0.628148955278821 | 0.038 |
| 0.628149486390842 | 0.038 |
| 0.62823573186417 | 0.038 |
| 0.628717921724982 | 0.037 |
| 0.628721878154451 | 0.037 |
| 0.62874005244218 | 0.037 |
| 0.628740331504427 | 0.037 |
| 0.629477111347199 | 0.037 |
| 0.629478806993385 | 0.037 |
| 0.629830827743262 | 0.037 |
| 0.629831924740965 | 0.037 |
| 0.629948901398248 | 0.037 |
| 0.630024918633494 | 0.037 |
| 0.630028356482965 | 0.037 |
| 0.630030670060591 | 0.037 |
| 0.630032992571779 | 0.037 |
| 0.630044687411044 | 0.037 |
| 0.630050721350909 | 0.037 |
| 0.630054261391726 | 0.037 |
| 0.630059767339261 | 0.037 |
| 0.630458145125021 | 0.037 |
| 0.63049168241469 | 0.037 |
| 0.630542247961257 | 0.037 |
| 0.631602629503987 | 0.037 |
| 0.631606265957337 | 0.037 |
| 0.631606270859325 | 0.037 |
| 0.631619215313531 | 0.037 |
| 0.631626992751907 | 0.037 |
| 0.631629466950178 | 0.037 |
| 0.633419424966208 | 0.037 |
| 0.633423040432845 | 0.037 |
| 0.63372470818051 | 0.037 |
| 0.633757632343711 | 0.036 |
| 0.633781424474662 | 0.036 |
| 0.634812595578379 | 0.036 |
| 0.634823707862965 | 0.036 |
| 0.63492286189778 | 0.036 |
| 0.634924245648237 | 0.036 |
| 0.634924715014687 | 0.036 |
| 0.634925436861159 | 0.036 |
| 0.634927427055956 | 0.036 |
| 0.634928376817155 | 0.036 |
| 0.63504805765007 | 0.036 |
| 0.635133317350289 | 0.036 |
| 0.635210549216693 | 0.036 |
| 0.639594517162962 | 0.036 |
| 0.63960123321923 | 0.036 |
| 0.639610321401953 | 0.036 |
| 0.639712396518702 | 0.036 |
| 0.639714974780472 | 0.036 |
| 0.639881331252402 | 0.036 |
| 0.639889152733139 | 0.036 |
| 0.63989265409513 | 0.036 |
| 0.639894631939077 | 0.036 |
| 0.640250279454989 | 0.036 |
| 0.640251432821561 | 0.036 |
| 0.64025229629487 | 0.036 |
| 0.640499736591325 | 0.036 |
| 0.641041875558657 | 0.036 |
| 0.641065877975967 | 0.036 |
| 0.641526260458148 | 0.035 |
| 0.641957976068579 | 0.035 |
| 0.643031490745214 | 0.035 |
| 0.643043499917921 | 0.035 |
| 0.643291636195933 | 0.035 |
| 0.643294008803534 | 0.035 |
| 0.643297741057288 | 0.035 |
| 0.643303036422202 | 0.035 |
| 0.643303903612033 | 0.035 |
| 0.643305557904909 | 0.035 |
| 0.644291584508914 | 0.035 |
| 0.644423881845572 | 0.035 |
| 0.645067621082127 | 0.035 |
| 0.645836893742327 | 0.035 |
| 0.645843638903615 | 0.035 |
| 0.646544073345065 | 0.035 |
| 0.646564439479565 | 0.035 |
| 0.646565360794946 | 0.035 |
| 0.646569570397525 | 0.035 |
| 0.647331021741018 | 0.035 |
| 0.648126944386326 | 0.035 |
| 0.648917412851249 | 0.035 |
| 0.64917787533116 | 0.035 |
| 0.649179502919903 | 0.035 |
| 0.649180319074926 | 0.035 |
| 0.649209548827035 | 0.035 |
| 0.649233616773609 | 0.035 |
| 0.6492855966329 | 0.035 |
| 0.666566472019935 | 0.035 |
| 0.669586960345028 | 0.035 |
| 0.6705810002415 | 0.035 |
| 0.670623548734505 | 0.034 |
| 0.670623762820161 | 0.034 |
| 0.670752168940648 | 0.034 |
| 0.671074397551003 | 0.034 |
| 0.68121705625851 | 0.034 |
| 0.682209656946279 | 0.034 |
| 0.682324821851321 | 0.034 |
| 0.682346709573494 | 0.034 |
| 0.682349885881207 | 0.034 |
| 0.682435383008399 | 0.034 |
| 0.683499857521568 | 0.034 |
| 0.683722841744304 | 0.034 |
| 0.683727461311393 | 0.034 |
| 0.684025674544833 | 0.034 |
| 0.685176692520375 | 0.034 |
| 0.685195803766826 | 0.034 |
| 0.685197092980746 | 0.034 |
| 0.687830629563667 | 0.034 |
| 0.687981652333905 | 0.034 |
| 0.689298030505139 | 0.034 |
| 0.689515411059169 | 0.034 |
| 0.690319174622615 | 0.034 |
| 0.690338071689273 | 0.034 |
| 0.69034107002824 | 0.034 |
| 0.690354187280283 | 0.033 |
| 0.690557613153355 | 0.033 |
| 0.690904799934337 | 0.033 |
| 0.691205354690628 | 0.033 |
| 0.691205634034525 | 0.033 |
| 0.703094779332252 | 0.033 |
| 0.703121320100595 | 0.033 |
| 0.703140290217939 | 0.033 |
| 0.703149182057454 | 0.033 |
| 0.703151734850299 | 0.033 |
| 0.703388965623547 | 0.033 |
| 0.708857844706075 | 0.033 |
| 0.709150292187336 | 0.033 |
| 0.70917603684171 | 0.033 |
| 0.711638850803585 | 0.033 |
| 0.711646797570668 | 0.033 |
| 0.712999074203303 | 0.033 |
| 0.713034642808314 | 0.033 |
| 0.713035937781839 | 0.033 |
| 0.713138997581767 | 0.033 |
| 0.713712415114344 | 0.033 |
| 0.713713915984037 | 0.033 |
| 0.713714537860972 | 0.033 |
| 0.713715667570042 | 0.033 |
| 0.713716934158562 | 0.033 |
| 0.716578521732516 | 0.033 |
| 0.716582745204531 | 0.033 |
| 0.716738584175018 | 0.033 |
| 0.716741205474157 | 0.033 |
| 0.716774089140294 | 0.033 |
| 0.717595348751057 | 0.033 |
| 0.717596391373356 | 0.033 |
| 0.717596859564587 | 0.033 |
| 0.71760528389704 | 0.033 |
| 0.717649221810347 | 0.032 |
| 0.718848954895154 | 0.032 |
| 0.718920816984679 | 0.032 |
| 0.718923318989607 | 0.032 |
| 0.721874989312415 | 0.032 |
| 0.722902661815406 | 0.032 |
| 0.724623180216616 | 0.032 |
| 0.724641172282145 | 0.032 |
| 0.724644539675488 | 0.032 |
| 0.727916715786338 | 0.032 |
| 0.727917508750614 | 0.032 |
| 0.727997570277599 | 0.032 |
| 0.728027265132552 | 0.032 |
| 0.728027890770491 | 0.032 |
| 0.728035334451093 | 0.032 |
| 0.728035820799178 | 0.032 |
| 0.728036060112192 | 0.032 |
| 0.728646961421918 | 0.032 |
| 0.728647848591017 | 0.032 |
| 0.728649510735295 | 0.032 |
| 0.728652275225368 | 0.032 |
| 0.729541048798162 | 0.032 |
| 0.729542848765824 | 0.031 |
| 0.729561888931806 | 0.031 |
| 0.729562445809481 | 0.031 |
| 0.729563301461379 | 0.031 |
| 0.729564612601999 | 0.031 |
| 0.729567106607989 | 0.031 |
| 0.729727097425575 | 0.031 |
| 0.729738000315674 | 0.031 |
| 0.729739064839026 | 0.031 |
| 0.731057154908686 | 0.031 |
| 0.731084233460301 | 0.031 |
| 0.731087292322457 | 0.031 |
| 0.731089565113874 | 0.031 |
| 0.731090769622125 | 0.031 |
| 0.731092092184888 | 0.031 |
| 0.731118011346622 | 0.031 |
| 0.731119546837515 | 0.031 |
| 0.731122615277215 | 0.031 |
| 0.73123082314332 | 0.031 |
| 0.731231821955345 | 0.031 |
| 0.731234769695549 | 0.031 |
| 0.731422515299198 | 0.031 |
| 0.731422784363843 | 0.031 |
| 0.731430757715476 | 0.031 |
| 0.731432966983586 | 0.03 |
| 0.731434333513658 | 0.03 |
| 0.731438279306152 | 0.03 |
| 0.731927917509035 | 0.03 |
| 0.731939502511247 | 0.03 |
| 0.731941185856023 | 0.03 |
| 0.732068780803416 | 0.03 |
| 0.732189006232439 | 0.03 |
| 0.732199994713011 | 0.03 |
| 0.732358494338462 | 0.03 |
| 0.734339033190948 | 0.03 |
| 0.738341287458786 | 0.03 |
| 0.738347227845967 | 0.03 |
| 0.738411847701742 | 0.03 |
| 0.738923117468808 | 0.03 |
| 0.741712698137715 | 0.03 |
| 0.742203993516228 | 0.03 |
| 0.742207741465468 | 0.03 |
| 0.742926604305646 | 0.03 |
| 0.742959615903558 | 0.03 |
| 0.743560267861569 | 0.03 |
| 0.74366792751892 | 0.03 |
| 0.743668402893319 | 0.03 |
| 0.743671406376603 | 0.029 |
| 0.743696294712312 | 0.029 |
| 0.743698164613799 | 0.029 |
| 0.744481850035387 | 0.029 |
| 0.744815311808783 | 0.029 |
| 0.744962444866752 | 0.029 |
| 0.745027293329559 | 0.029 |
| 0.745085970795339 | 0.029 |
| 0.746250443614996 | 0.029 |
| 0.747607464784285 | 0.029 |
| 0.747611475954398 | 0.029 |
| 0.747623322644647 | 0.029 |
| 0.748675562631062 | 0.029 |
| 0.748886666144995 | 0.029 |
| 0.74888905485678 | 0.029 |
| 0.74889560541075 | 0.029 |
| 0.750637368964714 | 0.029 |
| 0.752143275905853 | 0.029 |
| 0.752147099817614 | 0.029 |
| 0.753527599752056 | 0.029 |
| 0.753812678442517 | 0.029 |
| 0.754058385933805 | 0.029 |
| 0.755717682270058 | 0.029 |
| 0.755750078768776 | 0.029 |
| 0.755751069342235 | 0.029 |
| 0.755757182328818 | 0.029 |
| 0.759124611056337 | 0.029 |
| 0.759128667785753 | 0.029 |
| 0.7591319825828 | 0.029 |
| 0.759149217342731 | 0.029 |
| 0.759150173781029 | 0.029 |
| 0.759150947884329 | 0.029 |
| 0.759151007163697 | 0.028 |
| 0.759555184536055 | 0.028 |
| 0.759555198110661 | 0.028 |
| 0.759555986440264 | 0.028 |
| 0.759636593096099 | 0.028 |
| 0.759721351222463 | 0.028 |
| 0.759760990766531 | 0.028 |
| 0.759765706155541 | 0.028 |
| 0.759809991519989 | 0.028 |
| 0.75982461059829 | 0.028 |
| 0.759972100394214 | 0.028 |
| 0.760175555382904 | 0.028 |
| 0.760776643165718 | 0.028 |
| 0.763881802617072 | 0.028 |
| 0.763885205996651 | 0.028 |
| 0.763908820073238 | 0.028 |
| 0.763931666603916 | 0.028 |
| 0.763933331366779 | 0.028 |
| 0.763941292809534 | 0.028 |
| 0.763957181118323 | 0.028 |
| 0.763959430110847 | 0.028 |
| 0.763963351015107 | 0.028 |
| 0.763996376853462 | 0.028 |
| 0.764630478783716 | 0.028 |
| 0.764631794093065 | 0.028 |
| 0.764646079443701 | 0.027 |
| 0.771890825006213 | 0.027 |
| 0.771890836523315 | 0.027 |
| 0.771894153633924 | 0.027 |
| 0.771956401191265 | 0.027 |
| 0.772912763989543 | 0.027 |
| 0.772912922560999 | 0.027 |
| 0.773058546736495 | 0.027 |
| 0.773945243273866 | 0.027 |
| 0.774186382201798 | 0.027 |
| 0.774827102252069 | 0.027 |
| 0.775225535254256 | 0.027 |
| 0.776333243347496 | 0.027 |
| 0.776801843542907 | 0.027 |
| 0.777659445761308 | 0.027 |
| 0.777659800367679 | 0.027 |
| 0.777663075667874 | 0.027 |
| 0.777667336166268 | 0.027 |
| 0.780678794109681 | 0.027 |
| 0.780788382527141 | 0.027 |
| 0.783213302655911 | 0.026 |
| 0.783451111529148 | 0.026 |
| 0.783479848531498 | 0.026 |
| 0.783529766185246 | 0.026 |
| 0.783533581503708 | 0.026 |
| 0.783533776406432 | 0.026 |
| 0.783571478019437 | 0.026 |
| 0.783591778922731 | 0.026 |
| 0.785526202811339 | 0.026 |
| 0.786835833420899 | 0.026 |
| 0.786845240145351 | 0.026 |
| 0.786860324207021 | 0.026 |
| 0.788937397414415 | 0.026 |
| 0.788940306586772 | 0.026 |
| 0.789960896025536 | 0.026 |
| 0.79509325250712 | 0.026 |
| 0.79866019442425 | 0.026 |
| 0.802298447222586 | 0.026 |
| 0.802305557050378 | 0.026 |
| 0.803153074881416 | 0.026 |
| 0.803154352236806 | 0.026 |
| 0.803168041773741 | 0.026 |
| 0.803185638230796 | 0.026 |
| 0.80319033241565 | 0.025 |
| 0.803196870829638 | 0.025 |
| 0.803225094311618 | 0.025 |
| 0.803227204555925 | 0.025 |
| 0.803258688669602 | 0.025 |
| 0.80563538342946 | 0.025 |
| 0.805649034635731 | 0.025 |
| 0.806400806280509 | 0.025 |
| 0.806411259572282 | 0.025 |
| 0.806476806755263 | 0.025 |
| 0.806476909377494 | 0.025 |
| 0.807403356441691 | 0.025 |
| 0.80749789390805 | 0.025 |
| 0.807497971386041 | 0.025 |
| 0.808037955435274 | 0.025 |
| 0.808040677909486 | 0.025 |
| 0.808100485171715 | 0.025 |
| 0.808106420490408 | 0.025 |
| 0.809166691694329 | 0.025 |
| 0.809167395186973 | 0.025 |
| 0.810887185854355 | 0.025 |
| 0.810889615081298 | 0.025 |
| 0.810889635786497 | 0.025 |
| 0.810894514250246 | 0.025 |
| 0.812494271375259 | 0.025 |
| 0.812705908473567 | 0.025 |
| 0.818943832153266 | 0.024 |
| 0.818958555339614 | 0.024 |
| 0.818959258609635 | 0.024 |
| 0.818961629219644 | 0.024 |
| 0.820631334299506 | 0.024 |
| 0.8206329744573 | 0.024 |
| 0.820746288319396 | 0.024 |
| 0.826168928007606 | 0.024 |
| 0.826302402860793 | 0.024 |
| 0.826302584210168 | 0.024 |
| 0.826858286749811 | 0.024 |
| 0.826881751969155 | 0.024 |
| 0.826907690240611 | 0.023 |
| 0.827021749754276 | 0.023 |
| 0.82795366580886 | 0.023 |
| 0.827955685482976 | 0.023 |
| 0.828114296282997 | 0.023 |
| 0.828604619322081 | 0.023 |
| 0.828618413008988 | 0.023 |
| 0.828732382370208 | 0.023 |
| 0.828734916276341 | 0.023 |
| 0.831684012569844 | 0.023 |
| 0.831913789826075 | 0.023 |
| 0.831914464664567 | 0.023 |
| 0.83194100543291 | 0.023 |
| 0.832110757785866 | 0.023 |
| 0.832111579924827 | 0.022 |
| 0.832111721717533 | 0.022 |
| 0.834723272149296 | 0.022 |
| 0.834729146845469 | 0.022 |
| 0.834740707383418 | 0.022 |
| 0.837019667640948 | 0.022 |
| 0.838793104720379 | 0.022 |
| 0.841184164011035 | 0.022 |
| 0.841188831561983 | 0.022 |
| 0.841215179900011 | 0.022 |
| 0.841348974267246 | 0.022 |
| 0.841955949809794 | 0.022 |
| 0.841956189597791 | 0.022 |
| 0.841999000247325 | 0.022 |
| 0.842004397113786 | 0.022 |
| 0.842004486392617 | 0.022 |
| 0.843982359766644 | 0.021 |
| 0.844022221658982 | 0.021 |
| 0.844206285007723 | 0.021 |
| 0.844266431573185 | 0.021 |
| 0.844267264033433 | 0.021 |
| 0.844272279263836 | 0.021 |
| 0.84432648152658 | 0.021 |
| 0.844470940079981 | 0.021 |
| 0.844474690834744 | 0.021 |
| 0.844474705998757 | 0.021 |
| 0.844476188007641 | 0.02 |
| 0.844489763514153 | 0.02 |
| 0.846634153138285 | 0.02 |
| 0.846639580615251 | 0.02 |
| 0.846825875591463 | 0.02 |
| 0.846827589233088 | 0.02 |
| 0.849164745476421 | 0.02 |
| 0.849167775068769 | 0.02 |
| 0.850500698727912 | 0.02 |
| 0.850624220232065 | 0.02 |
| 0.8520488001765 | 0.02 |
| 0.852089572132477 | 0.02 |
| 0.852089667120865 | 0.02 |
| 0.852092780804124 | 0.02 |
| 0.852102406922313 | 0.02 |
| 0.859466574260455 | 0.02 |
| 0.859486004651701 | 0.02 |
| 0.859525423748118 | 0.02 |
| 0.859766976792359 | 0.019 |
| 0.860821210984579 | 0.019 |
| 0.861081533467427 | 0.019 |
| 0.861084558678971 | 0.019 |
| 0.862522433896726 | 0.019 |
| 0.862556584667835 | 0.019 |
| 0.864306826871672 | 0.019 |
| 0.86434759255182 | 0.019 |
| 0.864357176315029 | 0.019 |
| 0.864360165538008 | 0.019 |
| 0.864380951045868 | 0.018 |
| 0.864381061797495 | 0.018 |
| 0.864385789481849 | 0.018 |
| 0.864387999893775 | 0.018 |
| 0.864612645153599 | 0.018 |
| 0.864621667121018 | 0.018 |
| 0.864630985188817 | 0.018 |
| 0.864634847728002 | 0.018 |
| 0.864635065005884 | 0.018 |
| 0.864636552132187 | 0.018 |
| 0.867637347027943 | 0.018 |
| 0.867647668301159 | 0.018 |
| 0.86820037201983 | 0.018 |
| 0.869837163690949 | 0.018 |
| 0.869984289700759 | 0.018 |
| 0.869985323374742 | 0.018 |
| 0.870010366069891 | 0.018 |
| 0.870282527748186 | 0.018 |
| 0.870283699585356 | 0.017 |
| 0.874193666743044 | 0.017 |
| 0.875350578419438 | 0.017 |
| 0.875386358570749 | 0.017 |
| 0.876230138569121 | 0.017 |
| 0.876232494775993 | 0.017 |
| 0.876240171297332 | 0.017 |
| 0.877318213575315 | 0.017 |
| 0.879012015838523 | 0.017 |
| 0.881743493561485 | 0.016 |
| 0.881745201101886 | 0.016 |
| 0.882529102369662 | 0.016 |
| 0.883390333472153 | 0.016 |
| 0.883390365217895 | 0.016 |
| 0.883390854900851 | 0.016 |
| 0.883391298274045 | 0.016 |
| 0.883441690393113 | 0.016 |
| 0.883450586262549 | 0.016 |
| 0.883470411702106 | 0.016 |
| 0.883470889646644 | 0.016 |
| 0.883933208477521 | 0.016 |
| 0.883934208991941 | 0.016 |
| 0.883934800159517 | 0.016 |
| 0.883987787492324 | 0.016 |
| 0.883990143573709 | 0.016 |
| 0.886023039036305 | 0.016 |
| 0.887129929975848 | 0.015 |
| 0.887240881610542 | 0.015 |
| 0.887243562151172 | 0.015 |
| 0.888991212450941 | 0.015 |
| 0.889002610926688 | 0.015 |
| 0.889004037439072 | 0.015 |
| 0.889006155967895 | 0.015 |
| 0.889076741757468 | 0.015 |
| 0.889082862159525 | 0.015 |
| 0.890369873061367 | 0.014 |
| 0.896438722802982 | 0.014 |
| 0.896440734511142 | 0.014 |
| 0.896441586003068 | 0.014 |
| 0.896444862843144 | 0.014 |
| 0.896733869273578 | 0.014 |
| 0.896734186975867 | 0.014 |
| 0.898691639448697 | 0.014 |
| 0.898768315267524 | 0.013 |
| 0.898768321315609 | 0.013 |
| 0.899190256929332 | 0.013 |
| 0.899191167843397 | 0.013 |
| 0.902484016423512 | 0.013 |
| 0.902484333589633 | 0.013 |
| 0.902603391347648 | 0.012 |
| 0.902993595430627 | 0.012 |
| 0.902993949936929 | 0.012 |
| 0.902994081691644 | 0.012 |
| 0.90326710511078 | 0.012 |
| 0.903268963672676 | 0.012 |
| 0.903270537133719 | 0.012 |
| 0.903277014991087 | 0.011 |
| 0.903279262098534 | 0.011 |
| 0.903552703529394 | 0.011 |
| 0.905421702747267 | 0.011 |
| 0.905425321261897 | 0.011 |
| 0.905425400644618 | 0.011 |
| 0.905434218591501 | 0.01 |
| 0.905441659333791 | 0.01 |
| 0.905442134652728 | 0.01 |
| 0.905446054635809 | 0.01 |
| 0.905449115611407 | 0.009 |
| 0.905449955476012 | 0.009 |
| 0.905451373370467 | 0.009 |
| 0.905453264813446 | 0.009 |
| 0.907347197194399 | 0.008 |
| 0.9087757837718 | 0.008 |
| 0.908799038963432 | 0.008 |
| 0.909909182446592 | 0.008 |
| 0.909913797489601 | 0.007 |
| 0.909917365658718 | 0.007 |
| 0.909918896614346 | 0.007 |
| 0.909935779458506 | 0.007 |
| 0.909936169918815 | 0.006 |
| 0.910503164238359 | 0.005 |
| 0.910504459630935 | 0.005 |
| 0.910504647893211 | 0.005 |
| 0.9105098886906 | 0.004 |
| 0.910914142678524 | 0.004 |
| 0.910914968837964 | 0.003 |
| 0.910915770386042 | 0.003 |
| 0.910916664927242 | 0.003 |
| 0.910917499157138 | 0.001 |
| 0.910923844229802 | 0.001 |
| 1.0 | 0 |